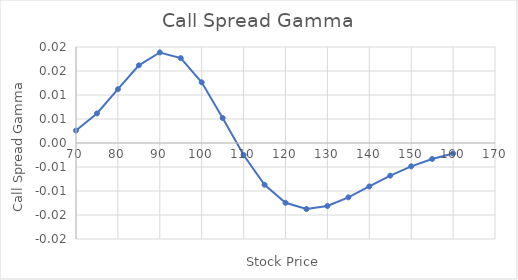
| Category | Gamma |
|---|---|
| 70.0 | 0.003 |
| 75.0 | 0.006 |
| 80.0 | 0.011 |
| 85.0 | 0.016 |
| 90.0 | 0.019 |
| 95.0 | 0.018 |
| 100.0 | 0.013 |
| 105.0 | 0.005 |
| 110.0 | -0.002 |
| 115.0 | -0.009 |
| 120.0 | -0.012 |
| 125.0 | -0.014 |
| 130.0 | -0.013 |
| 135.0 | -0.011 |
| 140.0 | -0.009 |
| 145.0 | -0.007 |
| 150.0 | -0.005 |
| 155.0 | -0.003 |
| 160.0 | -0.002 |